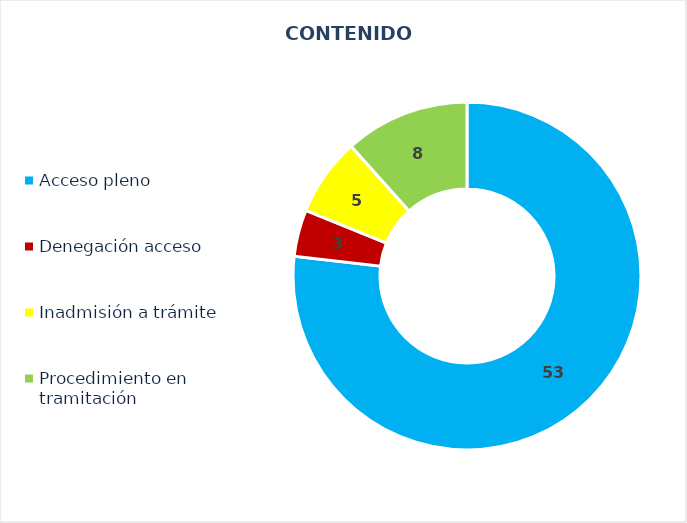
| Category | NÚMERO |
|---|---|
| Acceso pleno | 53 |
| Denegación acceso | 3 |
| Inadmisión a trámite | 5 |
| Procedimiento en tramitación | 8 |